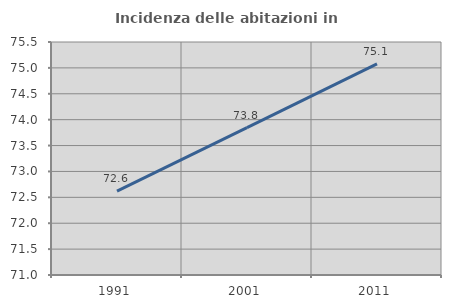
| Category | Incidenza delle abitazioni in proprietà  |
|---|---|
| 1991.0 | 72.621 |
| 2001.0 | 73.846 |
| 2011.0 | 75.077 |